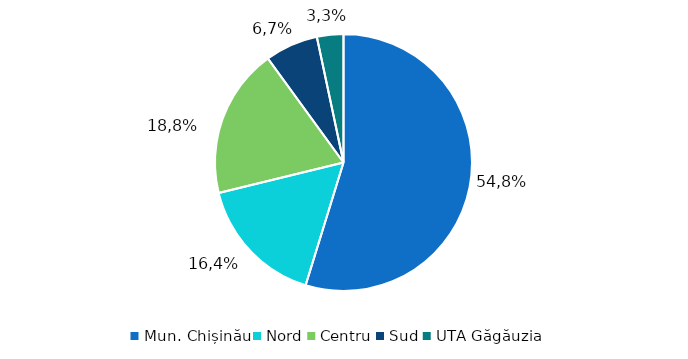
| Category | Series 0 |
|---|---|
| Mun. Chișinău | 54.762 |
| Nord | 16.429 |
| Centru | 18.81 |
| Sud | 6.667 |
| UTA Găgăuzia | 3.333 |